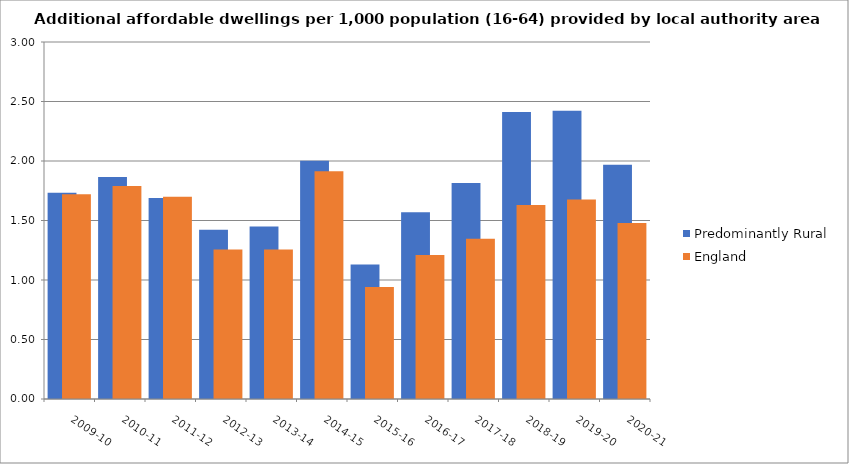
| Category | Predominantly Rural | England |
|---|---|---|
| 2009-10 | 1.733 | 1.72 |
| 2010-11 | 1.866 | 1.791 |
| 2011-12 | 1.689 | 1.699 |
| 2012-13 | 1.423 | 1.256 |
| 2013-14 | 1.449 | 1.255 |
| 2014-15 | 2.003 | 1.913 |
| 2015-16 | 1.13 | 0.941 |
| 2016-17 | 1.57 | 1.211 |
| 2017-18 | 1.814 | 1.347 |
| 2018-19 | 2.412 | 1.631 |
| 2019-20 | 2.422 | 1.677 |
| 2020-21 | 1.969 | 1.479 |